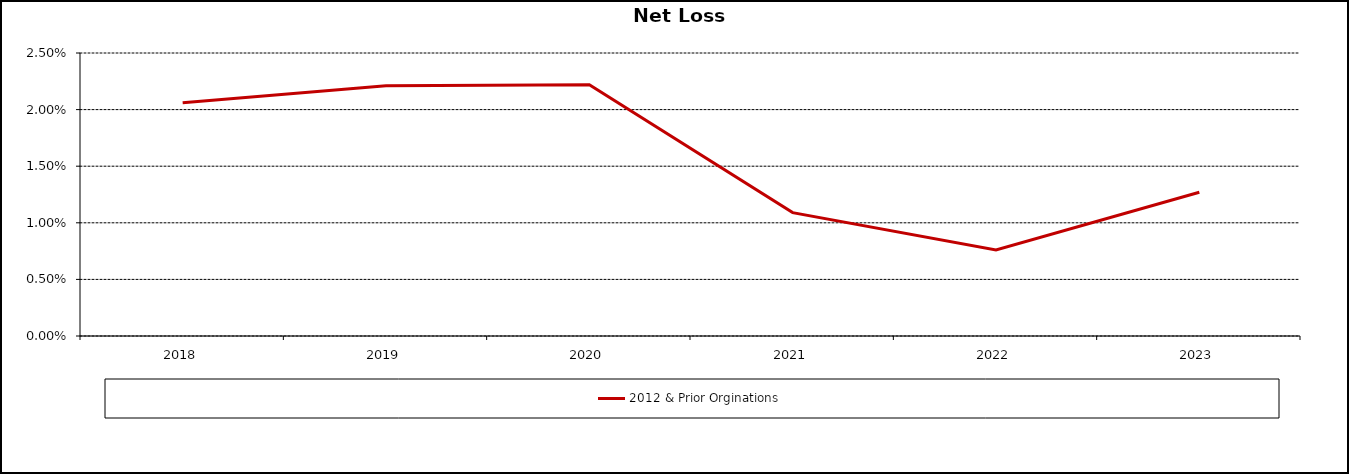
| Category | 2012 & Prior Orginations |
|---|---|
| 2018 | 0.021 |
| 2019 | 0.022 |
| 2020 | 0.022 |
| 2021 | 0.011 |
| 2022 | 0.008 |
| 2023 | 0.013 |